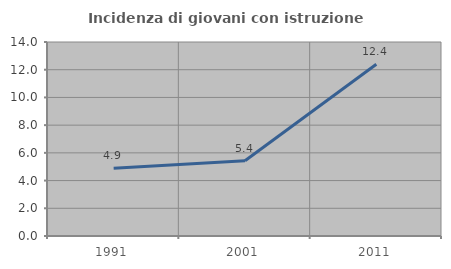
| Category | Incidenza di giovani con istruzione universitaria |
|---|---|
| 1991.0 | 4.895 |
| 2001.0 | 5.426 |
| 2011.0 | 12.389 |